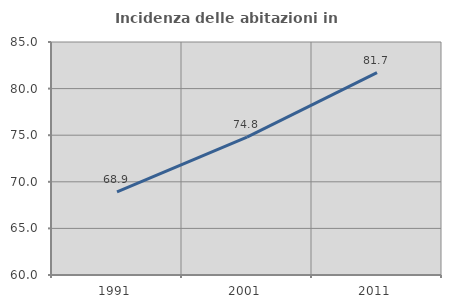
| Category | Incidenza delle abitazioni in proprietà  |
|---|---|
| 1991.0 | 68.919 |
| 2001.0 | 74.8 |
| 2011.0 | 81.723 |